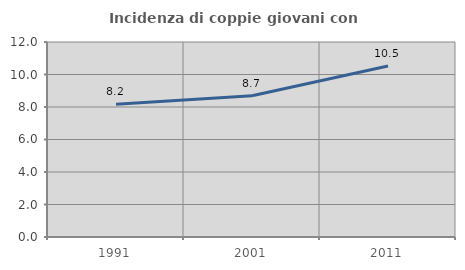
| Category | Incidenza di coppie giovani con figli |
|---|---|
| 1991.0 | 8.163 |
| 2001.0 | 8.696 |
| 2011.0 | 10.526 |